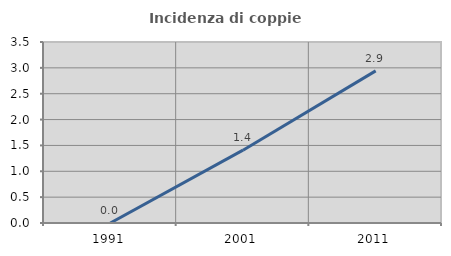
| Category | Incidenza di coppie miste |
|---|---|
| 1991.0 | 0 |
| 2001.0 | 1.408 |
| 2011.0 | 2.941 |